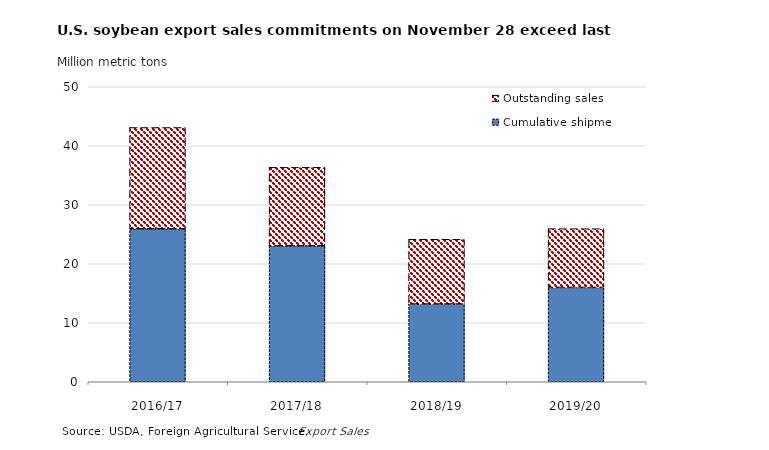
| Category | Cumulative | Outstanding sales |
|---|---|---|
| 2016/17 | 25.93 | 17.16 |
| 2017/18 | 23.04 | 13.302 |
| 2018/19 | 13.168 | 10.981 |
| 2019/20 | 15.988 | 9.956 |